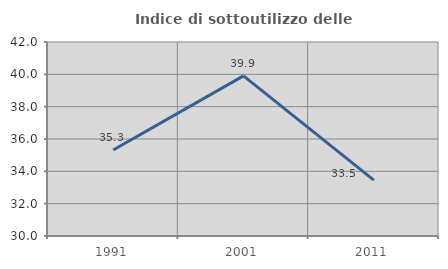
| Category | Indice di sottoutilizzo delle abitazioni  |
|---|---|
| 1991.0 | 35.323 |
| 2001.0 | 39.901 |
| 2011.0 | 33.453 |